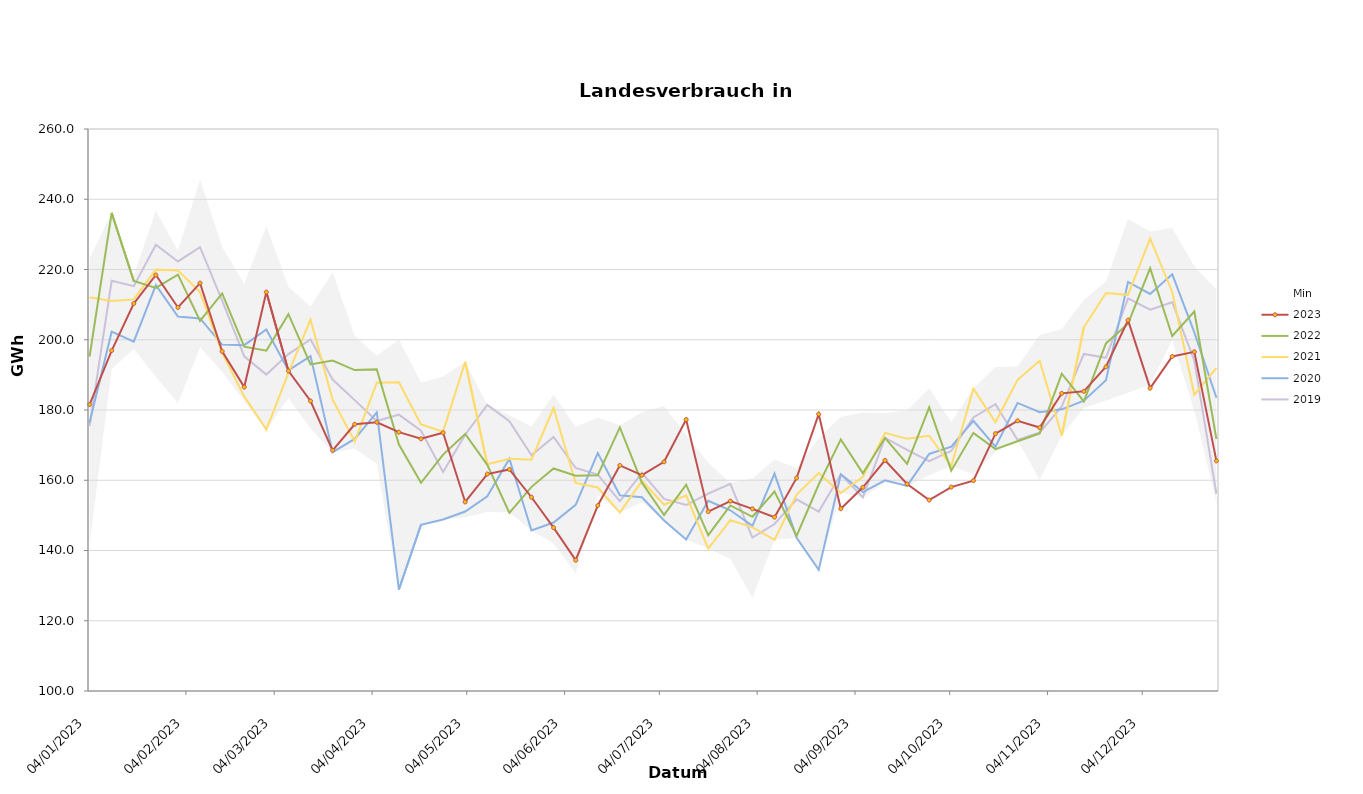
| Category | 2019 | 2020 | 2021 | 2022 | 2023 |
|---|---|---|---|---|---|
| 04/01/2023 | 175.427 | 176.434 | 212.115 | 195.239 | 181.555 |
| 11/01/2023 | 216.769 | 202.298 | 211.044 | 236.116 | 196.922 |
| 18/01/2023 | 215.242 | 199.472 | 211.487 | 216.74 | 210.308 |
| 25/01/2023 | 227.044 | 215.528 | 219.987 | 214.748 | 218.449 |
| 01/02/2023 | 222.292 | 206.627 | 219.737 | 218.553 | 209.184 |
| 08/02/2023 | 226.345 | 206.067 | 213.559 | 205.377 | 216.129 |
| 15/02/2023 | 211.151 | 198.625 | 196.257 | 213.173 | 196.69 |
| 22/02/2023 | 195.293 | 198.461 | 183.868 | 198.033 | 186.533 |
| 01/03/2023 | 190.087 | 202.903 | 174.444 | 196.868 | 213.566 |
| 08/03/2023 | 195.923 | 191.281 | 190.597 | 207.272 | 191.126 |
| 15/03/2023 | 200.114 | 195.338 | 205.721 | 192.973 | 182.562 |
| 22/03/2023 | 188.658 | 167.989 | 182.926 | 194.061 | 168.502 |
| 29/03/2023 | 182.809 | 171.783 | 171.032 | 191.356 | 175.939 |
| 05/04/2023 | 176.858 | 179.333 | 187.766 | 191.565 | 176.513 |
| 12/04/2023 | 178.697 | 128.884 | 187.902 | 170.184 | 173.688 |
| 19/04/2023 | 174.092 | 147.321 | 175.913 | 159.268 | 171.794 |
| 26/04/2023 | 162.352 | 148.827 | 173.832 | 167.309 | 173.522 |
| 03/05/2023 | 172.953 | 151.106 | 193.723 | 173.161 | 153.82 |
| 10/05/2023 | 181.453 | 155.433 | 164.554 | 164.389 | 161.749 |
| 17/05/2023 | 176.814 | 166.147 | 166.118 | 150.733 | 163.086 |
| 24/05/2023 | 167.112 | 145.705 | 165.84 | 158.119 | 155.162 |
| 31/05/2023 | 172.33 | 147.972 | 180.574 | 163.35 | 146.517 |
| 07/06/2023 | 163.5 | 152.992 | 159.225 | 161.279 | 137.249 |
| 14/06/2023 | 161.599 | 167.732 | 157.945 | 161.449 | 152.807 |
| 21/06/2023 | 154.014 | 155.739 | 150.79 | 175.031 | 164.221 |
| 28/06/2023 | 162.117 | 155.156 | 159.81 | 159.306 | 161.437 |
| 05/07/2023 | 154.669 | 148.567 | 153.016 | 150.12 | 165.249 |
| 12/07/2023 | 152.945 | 143.148 | 155.732 | 158.731 | 177.281 |
| 19/07/2023 | 156.199 | 154.156 | 140.565 | 144.356 | 151.069 |
| 26/07/2023 | 158.952 | 151.449 | 148.637 | 152.839 | 154.065 |
| 02/08/2023 | 143.664 | 147.005 | 146.574 | 149.601 | 151.855 |
| 09/08/2023 | 147.536 | 161.882 | 143.011 | 156.768 | 149.495 |
| 16/08/2023 | 154.571 | 143.646 | 155.937 | 144.153 | 160.66 |
| 23/08/2023 | 151.065 | 134.481 | 162.063 | 158.793 | 178.823 |
| 30/08/2023 | 161.679 | 161.727 | 156.356 | 171.621 | 151.891 |
| 06/09/2023 | 155.121 | 156.638 | 160.958 | 161.955 | 157.989 |
| 13/09/2023 | 172.069 | 159.986 | 173.487 | 172.042 | 165.671 |
| 20/09/2023 | 168.658 | 158.38 | 171.785 | 164.648 | 158.926 |
| 27/09/2023 | 165.422 | 167.494 | 172.666 | 180.725 | 154.377 |
| 04/10/2023 | 168.389 | 169.557 | 164.063 | 162.722 | 158.06 |
| 11/10/2023 | 177.883 | 176.896 | 186.089 | 173.49 | 159.887 |
| 18/10/2023 | 181.655 | 169.561 | 176.509 | 168.875 | 173.267 |
| 25/10/2023 | 171.442 | 182.007 | 188.607 | 171.092 | 176.912 |
| 01/11/2023 | 173.575 | 179.396 | 193.997 | 173.346 | 174.998 |
| 08/11/2023 | 181.015 | 180.19 | 172.72 | 190.327 | 184.733 |
| 15/11/2023 | 195.973 | 182.632 | 203.547 | 182.437 | 185.309 |
| 22/11/2023 | 194.86 | 188.447 | 213.29 | 198.958 | 192.303 |
| 29/11/2023 | 211.75 | 216.455 | 212.791 | 204.591 | 205.558 |
| 06/12/2023 | 208.577 | 213.026 | 228.871 | 220.406 | 186.216 |
| 13/12/2023 | 210.685 | 218.633 | 213.615 | 201.067 | 195.226 |
| 20/12/2023 | 194.071 | 202.089 | 184.353 | 208.045 | 196.563 |
| 27/12/2023 | 156.165 | 183.475 | 191.989 | 171.744 | 165.51 |